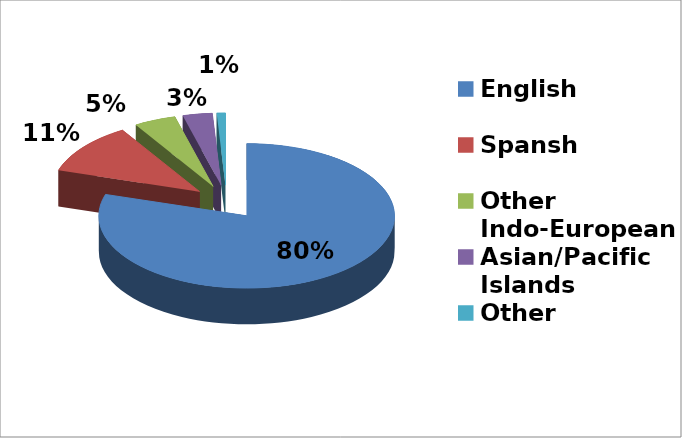
| Category | Series 0 |
|---|---|
| English | 0.798 |
| Spansh | 0.115 |
| Other Indo-European | 0.046 |
| Asian/Pacific Islands | 0.032 |
| Other | 0.01 |